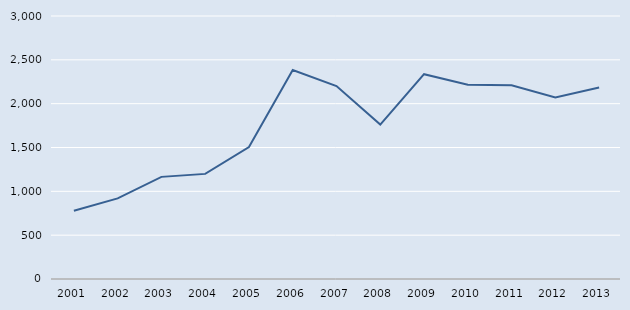
| Category | Series 0 |
|---|---|
| 2001.0 | 779 |
| 2002.0 | 920 |
| 2003.0 | 1165 |
| 2004.0 | 1199 |
| 2005.0 | 1505 |
| 2006.0 | 2383 |
| 2007.0 | 2201 |
| 2008.0 | 1761 |
| 2009.0 | 2336 |
| 2010.0 | 2217 |
| 2011.0 | 2211 |
| 2012.0 | 2071 |
| 2013.0 | 2184 |